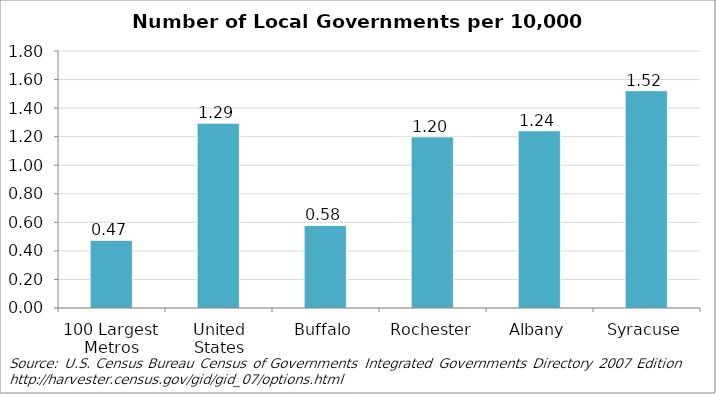
| Category | Number of Local Governments per 10,000 People |
|---|---|
| 100 Largest Metros | 0.474 |
| United States | 1.295 |
| Buffalo | 0.578 |
| Rochester | 1.199 |
| Albany | 1.241 |
| Syracuse | 1.522 |